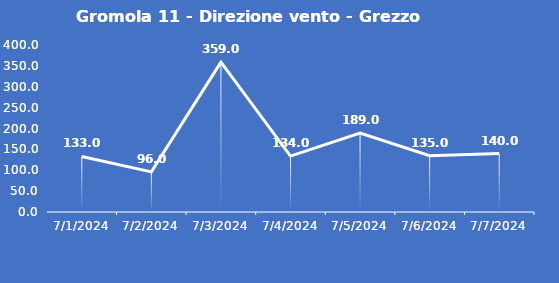
| Category | Gromola 11 - Direzione vento - Grezzo (°N) |
|---|---|
| 7/1/24 | 133 |
| 7/2/24 | 96 |
| 7/3/24 | 359 |
| 7/4/24 | 134 |
| 7/5/24 | 189 |
| 7/6/24 | 135 |
| 7/7/24 | 140 |